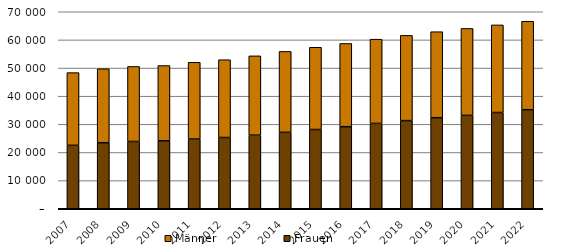
| Category | Frauen | Männer |
|---|---|---|
| 2007.0 | 22545 | 25830 |
| 2008.0 | 23460 | 26280 |
| 2009.0 | 23905 | 26665 |
| 2010.0 | 24165 | 26730 |
| 2011.0 | 24770 | 27270 |
| 2012.0 | 25315 | 27650 |
| 2013.0 | 26150 | 28185 |
| 2014.0 | 27155 | 28760 |
| 2015.0 | 28155 | 29230 |
| 2016.0 | 29155 | 29580 |
| 2017.0 | 30320 | 29940 |
| 2018.0 | 31315 | 30295 |
| 2019.0 | 32350 | 30570 |
| 2020.0 | 33185 | 30895 |
| 2021.0 | 34195 | 31135 |
| 2022.0 | 35195 | 31430 |